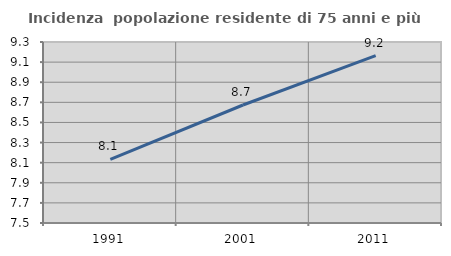
| Category | Incidenza  popolazione residente di 75 anni e più |
|---|---|
| 1991.0 | 8.132 |
| 2001.0 | 8.673 |
| 2011.0 | 9.165 |